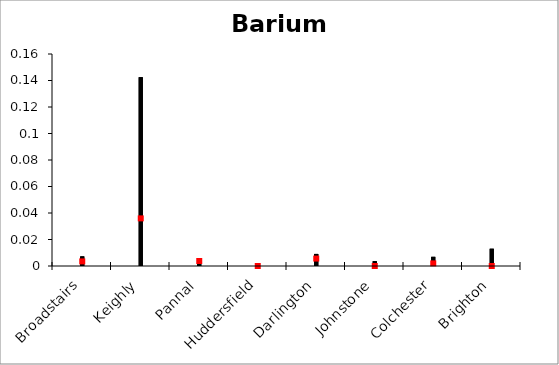
| Category | Barium | Series 1 | Series 2 |
|---|---|---|---|
| Broadstairs | 0.007 | 0 | 0.003 |
| Keighly | 0.142 | 0 | 0.036 |
| Pannal | 0.006 | 0 | 0.004 |
| Huddersfield | 0.002 | 0 | 0 |
| Darlington | 0.009 | 0 | 0.006 |
| Johnstone | 0.004 | 0 | 0 |
| Colchester | 0.007 | 0 | 0.002 |
| Brighton | 0.013 | 0 | 0 |